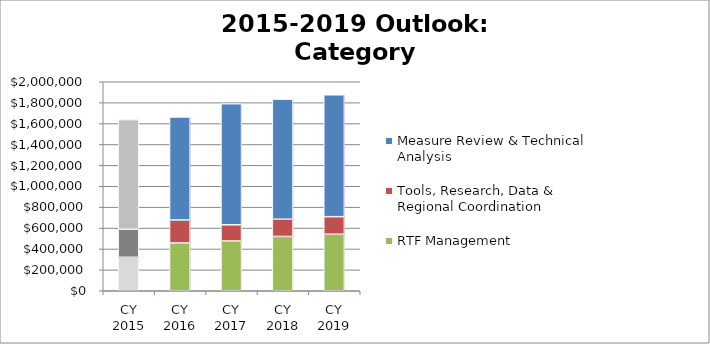
| Category | RTF Management | Tools, Research, Data & Regional Coordination | Measure Review & Technical Analysis |
|---|---|---|---|
| CY 2015 | 320100 | 268000 | 1049500 |
| CY 2016 | 457500 | 220000 | 985500 |
| CY 2017 | 476300 | 155000 | 1158500 |
| CY 2018 | 519500 | 165100 | 1149100 |
| CY 2019 | 541100 | 167800 | 1166300 |